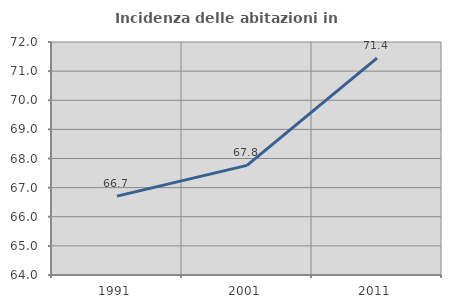
| Category | Incidenza delle abitazioni in proprietà  |
|---|---|
| 1991.0 | 66.708 |
| 2001.0 | 67.765 |
| 2011.0 | 71.445 |